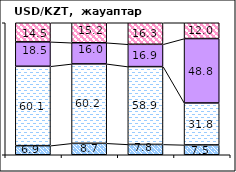
| Category | позитивно | не повлияло | негативно | не знаю |
|---|---|---|---|---|
| 0 | 6.89 | 60.12 | 18.51 | 14.47 |
| 1 | 8.66 | 60.17 | 16 | 15.16 |
| 2 | 7.83 | 58.94 | 16.92 | 16.32 |
| 3 | 7.45 | 31.8 | 48.75 | 12 |